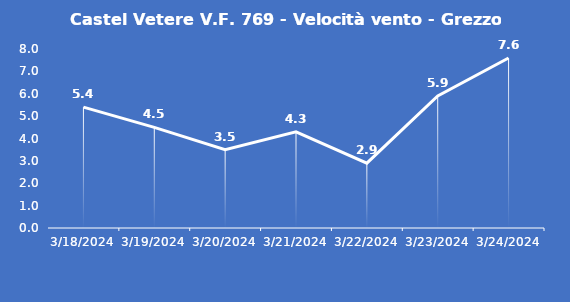
| Category | Castel Vetere V.F. 769 - Velocità vento - Grezzo (m/s) |
|---|---|
| 3/18/24 | 5.4 |
| 3/19/24 | 4.5 |
| 3/20/24 | 3.5 |
| 3/21/24 | 4.3 |
| 3/22/24 | 2.9 |
| 3/23/24 | 5.9 |
| 3/24/24 | 7.6 |